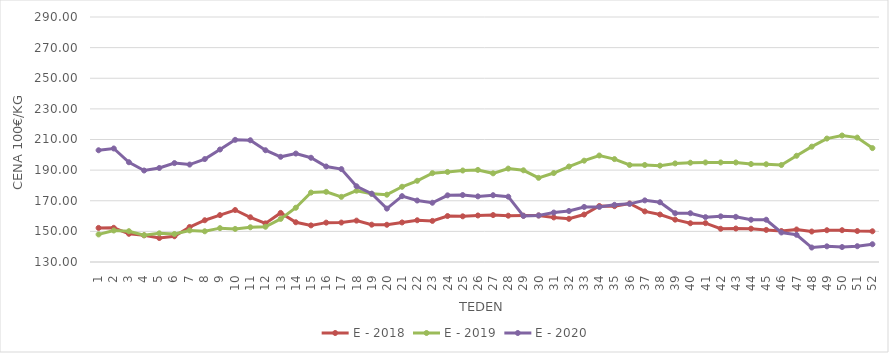
| Category | E - 2018 | E - 2019 | E - 2020 |
|---|---|---|---|
| 1.0 | 152.26 | 148.01 | 202.97 |
| 2.0 | 152.33 | 150.57 | 204.13 |
| 3.0 | 148.42 | 150.12 | 195.15 |
| 4.0 | 147.42 | 147.52 | 189.75 |
| 5.0 | 145.66 | 148.72 | 191.4 |
| 6.0 | 146.82 | 148.29 | 194.6 |
| 7.0 | 152.85 | 150.61 | 193.63 |
| 8.0 | 157.27 | 150.06 | 197.22 |
| 9.0 | 160.63 | 152.11 | 203.46 |
| 10.0 | 163.95 | 151.6 | 209.77 |
| 11.0 | 159.21 | 152.68 | 209.51 |
| 12.0 | 155.23 | 153.02 | 202.99 |
| 13.0 | 162.06 | 158.14 | 198.69 |
| 14.0 | 155.96 | 165.44 | 200.83 |
| 15.0 | 153.91 | 175.35 | 198.08 |
| 16.0 | 155.7 | 175.82 | 192.38 |
| 17.0 | 155.76 | 172.55 | 190.68 |
| 18.0 | 157.02 | 176.59 | 179.46 |
| 19.0 | 154.38 | 174.5 | 174.61 |
| 20.0 | 154.31 | 173.95 | 164.88 |
| 21.0 | 155.83 | 179.13 | 173.01 |
| 22.0 | 157.26 | 183.03 | 170.15 |
| 23.0 | 156.84 | 188.02 | 168.7 |
| 24.0 | 160.02 | 188.8 | 173.54 |
| 25.0 | 159.84 | 189.75 | 173.74 |
| 26.0 | 160.39 | 190.135 | 172.86 |
| 27.0 | 160.65 | 187.91 | 173.62 |
| 28.0 | 160.24 | 191 | 172.65 |
| 29.0 | 160.29 | 189.89 | 160.08 |
| 30.0 | 160.4 | 184.96 | 160.39 |
| 31.0 | 159.11 | 188.09 | 162.29 |
| 32.0 | 158.2 | 192.34 | 163.31 |
| 33.0 | 160.99 | 196.17 | 165.96 |
| 34.0 | 166.57 | 199.54 | 165.96 |
| 35.0 | 166.47 | 197.21 | 167.33 |
| 36.0 | 168.23 | 193.36 | 167.98 |
| 37.0 | 163.04 | 193.37 | 170.24 |
| 38.0 | 161.02 | 192.92 | 169.01 |
| 39.0 | 157.66 | 194.38 | 161.85 |
| 40.0 | 155.31 | 194.84 | 161.85 |
| 41.0 | 155.38 | 195.01 | 159.29 |
| 42.0 | 151.7 | 195.02 | 159.81 |
| 43.0 | 151.85 | 194.99 | 159.49 |
| 44.0 | 151.76 | 193.97 | 157.59 |
| 45.0 | 150.96 | 193.84 | 157.6 |
| 46.0 | 150.24 | 193.34 | 149.29 |
| 47.0 | 151.23 | 199.38 | 147.77 |
| 48.0 | 149.9 | 205.33 | 139.45 |
| 49.0 | 150.75 | 210.61 | 140.23 |
| 50.0 | 150.77 | 212.61 | 139.77 |
| 51.0 | 150.22 | 211.25 | 140.32 |
| 52.0 | 150.06 | 204.38 | 141.6 |